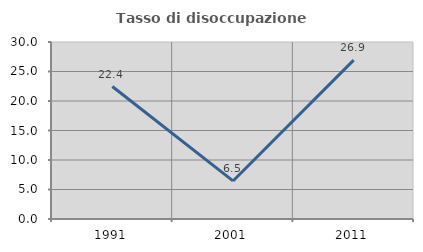
| Category | Tasso di disoccupazione giovanile  |
|---|---|
| 1991.0 | 22.449 |
| 2001.0 | 6.452 |
| 2011.0 | 26.923 |